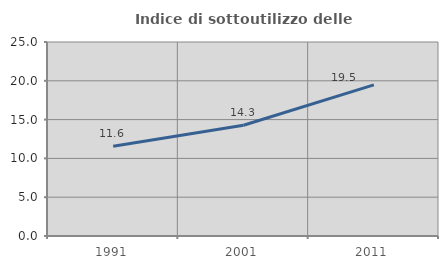
| Category | Indice di sottoutilizzo delle abitazioni  |
|---|---|
| 1991.0 | 11.578 |
| 2001.0 | 14.268 |
| 2011.0 | 19.471 |